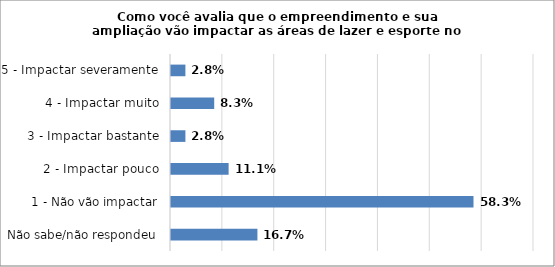
| Category | Series 0 |
|---|---|
| Não sabe/não respondeu | 0.167 |
| 1 - Não vão impactar | 0.583 |
| 2 - Impactar pouco | 0.111 |
| 3 - Impactar bastante | 0.028 |
| 4 - Impactar muito | 0.083 |
| 5 - Impactar severamente | 0.028 |